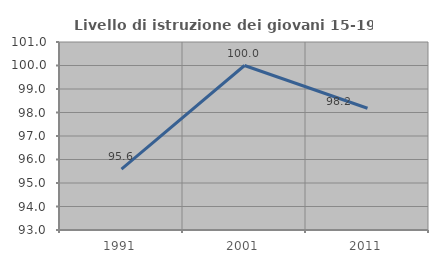
| Category | Livello di istruzione dei giovani 15-19 anni |
|---|---|
| 1991.0 | 95.588 |
| 2001.0 | 100 |
| 2011.0 | 98.182 |